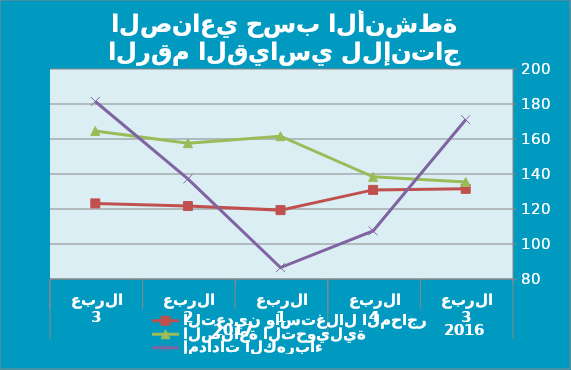
| Category | IIPالرقم القياسي العام  | التعدين واستغلال المحاجر | الصناعة التحويلية | إمدادات الكهرباء |
|---|---|---|---|---|
| 0 |  | 131.51 | 135.43 | 171 |
| 1 |  | 130.91 | 138.37 | 107.49 |
| 2 |  | 119.36 | 161.6 | 86.5 |
| 3 |  | 121.69 | 157.62 | 137.2 |
| 4 |  | 123.2 | 164.6 | 181.44 |